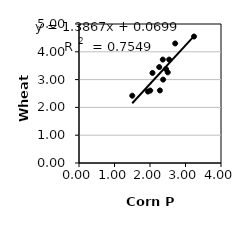
| Category | Series 0 |
|---|---|
| 1.5 | 2.42 |
| 1.94 | 2.57 |
| 2.54 | 3.72 |
| 2.36 | 3.72 |
| 2.28 | 2.61 |
| 2.37 | 3 |
| 2.07 | 3.24 |
| 2.5 | 3.26 |
| 2.26 | 3.45 |
| 3.24 | 4.55 |
| 2.71 | 4.3 |
| 2.45 | 3.38 |
| 2.0070400979 | 2.605 |